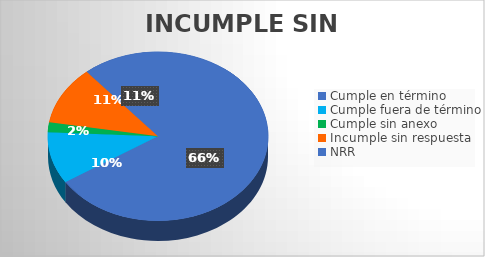
| Category | TOTAL |
|---|---|
| Cumple en término | 106 |
| Cumple fuera de término | 16 |
| Cumple sin anexo | 3 |
| Incumple sin respuesta | 18 |
| NRR | 18 |